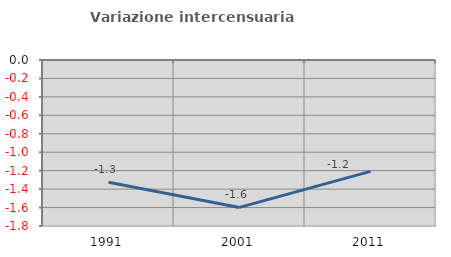
| Category | Variazione intercensuaria annua |
|---|---|
| 1991.0 | -1.325 |
| 2001.0 | -1.599 |
| 2011.0 | -1.208 |